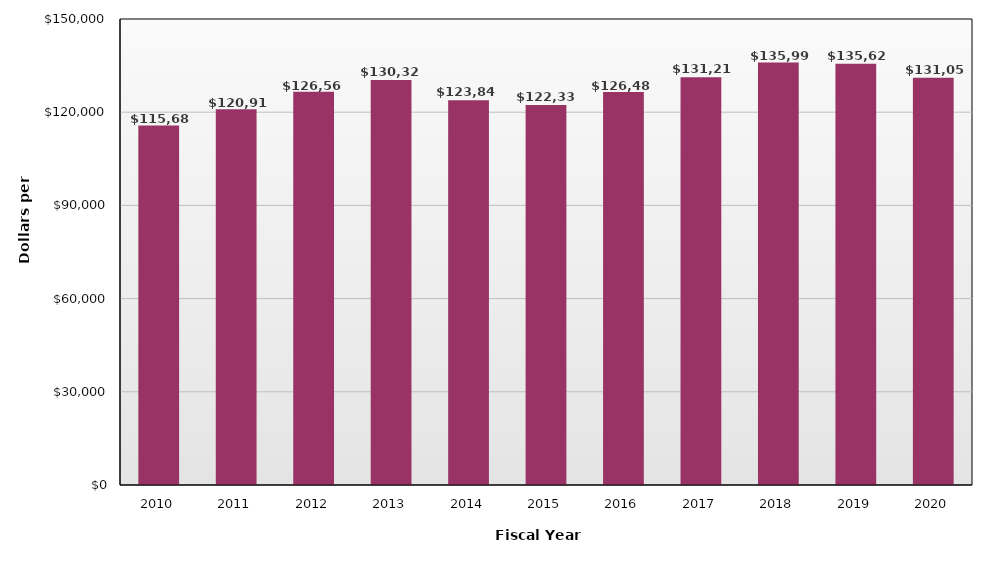
| Category | Total Revenue |
|---|---|
| 2010.0 | 115680 |
| 2011.0 | 120916 |
| 2012.0 | 126566 |
| 2013.0 | 130329 |
| 2014.0 | 123845 |
| 2015.0 | 122332 |
| 2016.0 | 126489 |
| 2017.0 | 131211 |
| 2018.0 | 135995 |
| 2019.0 | 135628 |
| 2020.0 | 131050 |